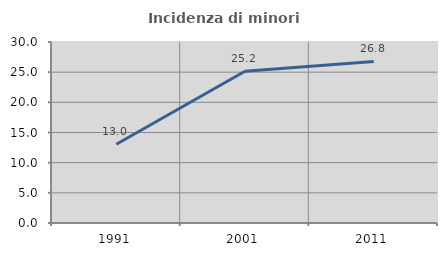
| Category | Incidenza di minori stranieri |
|---|---|
| 1991.0 | 13.043 |
| 2001.0 | 25.161 |
| 2011.0 | 26.778 |